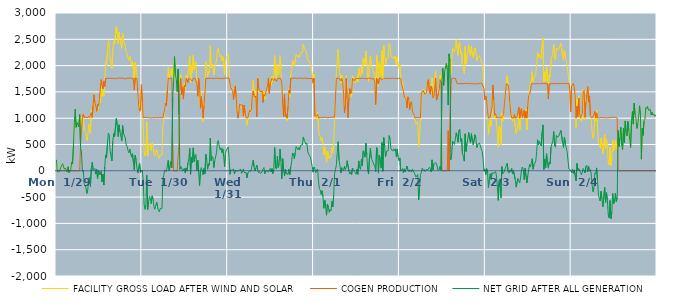
| Category | FACILITY GROSS LOAD AFTER WIND AND SOLAR | COGEN PRODUCTION | NET GRID AFTER ALL GENERATION |
|---|---|---|---|
|  Mon  1/29 | 209 | 0 | 209 |
|  Mon  1/29 | -16 | 0 | -16 |
|  Mon  1/29 | -6 | 0 | -6 |
|  Mon  1/29 | -16 | 0 | -16 |
|  Mon  1/29 | 22 | 0 | 22 |
|  Mon  1/29 | 5 | 0 | 5 |
|  Mon  1/29 | 108 | 0 | 108 |
|  Mon  1/29 | 135 | 0 | 135 |
|  Mon  1/29 | 73 | 0 | 73 |
|  Mon  1/29 | 30 | 0 | 30 |
|  Mon  1/29 | 54 | 0 | 54 |
|  Mon  1/29 | 37 | 0 | 37 |
|  Mon  1/29 | -21 | 0 | -21 |
|  Mon  1/29 | 78 | 0 | 78 |
|  Mon  1/29 | -37 | 0 | -37 |
|  Mon  1/29 | -8 | 0 | -8 |
|  Mon  1/29 | 23 | 0 | 23 |
|  Mon  1/29 | 167 | 0 | 167 |
|  Mon  1/29 | 128 | 0 | 128 |
|  Mon  1/29 | 474 | 0 | 474 |
|  Mon  1/29 | 912 | 0 | 912 |
|  Mon  1/29 | 1172 | 0 | 1172 |
|  Mon  1/29 | 826 | 0 | 826 |
|  Mon  1/29 | 916 | 0 | 916 |
|  Mon  1/29 | 912 | 0 | 912 |
|  Mon  1/29 | 835 | 0 | 835 |
|  Mon  1/29 | 1069 | 0 | 1069 |
|  Mon  1/29 | 931 | 511 | 420 |
|  Mon  1/29 | 860 | 502 | 358 |
|  Mon  1/29 | 994 | 1013 | -19 |
|  Mon  1/29 | 1088 | 1082 | 6 |
|  Mon  1/29 | 777 | 1016 | -239 |
|  Mon  1/29 | 767 | 1002 | -235 |
|  Mon  1/29 | 696 | 1015 | -319 |
|  Mon  1/29 | 570 | 1001 | -431 |
|  Mon  1/29 | 644 | 1007 | -363 |
|  Mon  1/29 | 887 | 1036 | -149 |
|  Mon  1/29 | 894 | 1013 | -119 |
|  Mon  1/29 | 714 | 1012 | -298 |
|  Mon  1/29 | 1152 | 1107 | 45 |
|  Mon  1/29 | 1173 | 1013 | 160 |
|  Mon  1/29 | 1250 | 1241 | 9 |
|  Mon  1/29 | 1454 | 1447 | 7 |
|  Mon  1/29 | 1335 | 1292 | 43 |
|  Mon  1/29 | 1159 | 1222 | -63 |
|  Mon  1/29 | 1159 | 1130 | 29 |
|  Mon  1/29 | 1120 | 1269 | -149 |
|  Mon  1/29 | 1238 | 1233 | 5 |
|  Mon  1/29 | 1373 | 1356 | 17 |
|  Mon  1/29 | 1294 | 1373 | -79 |
|  Mon  1/29 | 1721 | 1732 | -11 |
|  Mon  1/29 | 1412 | 1622 | -210 |
|  Mon  1/29 | 1496 | 1562 | -66 |
|  Mon  1/29 | 1431 | 1702 | -271 |
|  Mon  1/29 | 1677 | 1605 | 72 |
|  Mon  1/29 | 2059 | 1757 | 302 |
|  Mon  1/29 | 2002 | 1753 | 249 |
|  Mon  1/29 | 2262 | 1754 | 508 |
|  Mon  1/29 | 2477 | 1759 | 718 |
|  Mon  1/29 | 2448 | 1760 | 688 |
|  Mon  1/29 | 2137 | 1761 | 376 |
|  Mon  1/29 | 2142 | 1758 | 384 |
|  Mon  1/29 | 1943 | 1755 | 188 |
|  Mon  1/29 | 2318 | 1758 | 560 |
|  Mon  1/29 | 2466 | 1758 | 708 |
|  Mon  1/29 | 2408 | 1758 | 650 |
|  Mon  1/29 | 2426 | 1761 | 665 |
|  Mon  1/29 | 2746 | 1750 | 996 |
|  Mon  1/29 | 2613 | 1752 | 861 |
|  Mon  1/29 | 2416 | 1766 | 650 |
|  Mon  1/29 | 2637 | 1763 | 874 |
|  Mon  1/29 | 2499 | 1762 | 737 |
|  Mon  1/29 | 2412 | 1752 | 660 |
|  Mon  1/29 | 2327 | 1758 | 569 |
|  Mon  1/29 | 2616 | 1754 | 862 |
|  Mon  1/29 | 2475 | 1762 | 713 |
|  Mon  1/29 | 2453 | 1754 | 699 |
|  Mon  1/29 | 2366 | 1742 | 624 |
|  Mon  1/29 | 2255 | 1765 | 490 |
|  Mon  1/29 | 2222 | 1760 | 462 |
|  Mon  1/29 | 2142 | 1755 | 387 |
|  Mon  1/29 | 2101 | 1758 | 343 |
|  Mon  1/29 | 2179 | 1767 | 412 |
|  Mon  1/29 | 2080 | 1757 | 323 |
|  Mon  1/29 | 2013 | 1753 | 260 |
|  Mon  1/29 | 2085 | 1759 | 326 |
|  Mon  1/29 | 1922 | 1753 | 169 |
|  Mon  1/29 | 1557 | 1538 | 19 |
|  Mon  1/29 | 2060 | 1765 | 295 |
|  Mon  1/29 | 1977 | 1763 | 214 |
|  Mon  1/29 | 1813 | 1759 | 54 |
|  Mon  1/29 | 1451 | 1490 | -39 |
|  Mon  1/29 | 1204 | 1234 | -30 |
|  Mon  1/29 | 1273 | 1134 | 139 |
|  Mon  1/29 | 1128 | 1159 | -31 |
|  Mon  1/29 | 1616 | 1638 | -22 |
|  Tue  1/30 | 1338 | 1324 | 14 |
|  Tue  1/30 | 841 | 1013 | -172 |
|  Tue  1/30 | 369 | 1002 | -633 |
|  Tue  1/30 | 286 | 1017 | -731 |
|  Tue  1/30 | 344 | 1018 | -674 |
|  Tue  1/30 | 932 | 1016 | -84 |
|  Tue  1/30 | 278 | 1012 | -734 |
|  Tue  1/30 | 427 | 1011 | -584 |
|  Tue  1/30 | 517 | 1004 | -487 |
|  Tue  1/30 | 477 | 1000 | -523 |
|  Tue  1/30 | 382 | 1006 | -624 |
|  Tue  1/30 | 533 | 1009 | -476 |
|  Tue  1/30 | 483 | 1014 | -531 |
|  Tue  1/30 | 326 | 1005 | -679 |
|  Tue  1/30 | 285 | 1016 | -731 |
|  Tue  1/30 | 285 | 1011 | -726 |
|  Tue  1/30 | 410 | 1007 | -597 |
|  Tue  1/30 | 325 | 1005 | -680 |
|  Tue  1/30 | 257 | 1010 | -753 |
|  Tue  1/30 | 230 | 1012 | -782 |
|  Tue  1/30 | 300 | 1021 | -721 |
|  Tue  1/30 | 293 | 1007 | -714 |
|  Tue  1/30 | 300 | 1014 | -714 |
|  Tue  1/30 | 854 | 1012 | -158 |
|  Tue  1/30 | 934 | 1020 | -86 |
|  Tue  1/30 | 1172 | 1164 | 8 |
|  Tue  1/30 | 1292 | 1288 | 4 |
|  Tue  1/30 | 1231 | 1240 | -9 |
|  Tue  1/30 | 1525 | 1515 | 10 |
|  Tue  1/30 | 1964 | 1764 | 200 |
|  Tue  1/30 | 1759 | 1757 | 2 |
|  Tue  1/30 | 1842 | 1752 | 90 |
|  Tue  1/30 | 1939 | 1761 | 178 |
|  Tue  1/30 | 1811 | 1753 | 58 |
|  Tue  1/30 | 1953 | 544 | 1409 |
|  Tue  1/30 | 1686 | 0 | 1686 |
|  Tue  1/30 | 2172 | 0 | 2172 |
|  Tue  1/30 | 1828 | 0 | 1828 |
|  Tue  1/30 | 1736 | 0 | 1736 |
|  Tue  1/30 | 1506 | 0 | 1506 |
|  Tue  1/30 | 1933 | 0 | 1933 |
|  Tue  1/30 | 1575 | 510 | 1065 |
|  Tue  1/30 | 1683 | 1655 | 28 |
|  Tue  1/30 | 1836 | 1754 | 82 |
|  Tue  1/30 | 1506 | 1448 | 58 |
|  Tue  1/30 | 1588 | 1594 | -6 |
|  Tue  1/30 | 1364 | 1363 | 1 |
|  Tue  1/30 | 1671 | 1624 | 47 |
|  Tue  1/30 | 1554 | 1597 | -43 |
|  Tue  1/30 | 1814 | 1759 | 55 |
|  Tue  1/30 | 1761 | 1763 | -2 |
|  Tue  1/30 | 1826 | 1678 | 148 |
|  Tue  1/30 | 1981 | 1757 | 224 |
|  Tue  1/30 | 2187 | 1758 | 429 |
|  Tue  1/30 | 1672 | 1737 | -65 |
|  Tue  1/30 | 2004 | 1749 | 255 |
|  Tue  1/30 | 1862 | 1705 | 157 |
|  Tue  1/30 | 2194 | 1758 | 436 |
|  Tue  1/30 | 1925 | 1748 | 177 |
|  Tue  1/30 | 2041 | 1760 | 281 |
|  Tue  1/30 | 2068 | 1758 | 310 |
|  Tue  1/30 | 1657 | 1661 | -4 |
|  Tue  1/30 | 1621 | 1418 | 203 |
|  Tue  1/30 | 1734 | 1753 | -19 |
|  Tue  1/30 | 1332 | 1615 | -283 |
|  Tue  1/30 | 1192 | 1190 | 2 |
|  Tue  1/30 | 1471 | 1410 | 61 |
|  Tue  1/30 | 1217 | 1213 | 4 |
|  Tue  1/30 | 935 | 1012 | -77 |
|  Tue  1/30 | 1280 | 1238 | 42 |
|  Tue  1/30 | 1412 | 1469 | -57 |
|  Tue  1/30 | 2074 | 1760 | 314 |
|  Tue  1/30 | 1970 | 1755 | 215 |
|  Tue  1/30 | 1785 | 1755 | 30 |
|  Tue  1/30 | 1887 | 1753 | 134 |
|  Tue  1/30 | 1866 | 1762 | 104 |
|  Tue  1/30 | 2381 | 1760 | 621 |
|  Tue  1/30 | 1952 | 1760 | 192 |
|  Tue  1/30 | 2032 | 1760 | 272 |
|  Tue  1/30 | 2007 | 1756 | 251 |
|  Tue  1/30 | 1825 | 1764 | 61 |
|  Tue  1/30 | 1948 | 1757 | 191 |
|  Tue  1/30 | 1963 | 1754 | 209 |
|  Tue  1/30 | 2106 | 1764 | 342 |
|  Tue  1/30 | 2297 | 1755 | 542 |
|  Tue  1/30 | 2329 | 1755 | 574 |
|  Tue  1/30 | 2232 | 1758 | 474 |
|  Tue  1/30 | 2162 | 1762 | 400 |
|  Tue  1/30 | 2200 | 1763 | 437 |
|  Tue  1/30 | 2096 | 1749 | 347 |
|  Tue  1/30 | 2170 | 1753 | 417 |
|  Tue  1/30 | 2033 | 1761 | 272 |
|  Tue  1/30 | 1832 | 1755 | 77 |
|  Tue  1/30 | 2090 | 1760 | 330 |
|  Tue  1/30 | 2155 | 1763 | 392 |
|  Tue  1/30 | 2165 | 1762 | 403 |
|  Wed  1/31 | 2213 | 1761 | 452 |
|  Wed  1/31 | 2019 | 1765 | 254 |
|  Wed  1/31 | 1591 | 1658 | -67 |
|  Wed  1/31 | 1604 | 1583 | 21 |
|  Wed  1/31 | 1594 | 1595 | -1 |
|  Wed  1/31 | 1527 | 1527 | 0 |
|  Wed  1/31 | 1386 | 1350 | 36 |
|  Wed  1/31 | 1455 | 1513 | -58 |
|  Wed  1/31 | 1624 | 1617 | 7 |
|  Wed  1/31 | 1392 | 1392 | 0 |
|  Wed  1/31 | 1109 | 1113 | -4 |
|  Wed  1/31 | 1006 | 1001 | 5 |
|  Wed  1/31 | 1135 | 1130 | 5 |
|  Wed  1/31 | 1260 | 1273 | -13 |
|  Wed  1/31 | 1282 | 1250 | 32 |
|  Wed  1/31 | 1191 | 1239 | -48 |
|  Wed  1/31 | 1229 | 1248 | -19 |
|  Wed  1/31 | 1075 | 1039 | 36 |
|  Wed  1/31 | 1216 | 1250 | -34 |
|  Wed  1/31 | 1057 | 1084 | -27 |
|  Wed  1/31 | 977 | 1009 | -32 |
|  Wed  1/31 | 866 | 1003 | -137 |
|  Wed  1/31 | 965 | 1007 | -42 |
|  Wed  1/31 | 983 | 1011 | -28 |
|  Wed  1/31 | 1158 | 1151 | 7 |
|  Wed  1/31 | 1109 | 1124 | -15 |
|  Wed  1/31 | 1211 | 1175 | 36 |
|  Wed  1/31 | 1461 | 1433 | 28 |
|  Wed  1/31 | 1722 | 1517 | 205 |
|  Wed  1/31 | 1503 | 1429 | 74 |
|  Wed  1/31 | 1393 | 1398 | -5 |
|  Wed  1/31 | 1474 | 1423 | 51 |
|  Wed  1/31 | 1136 | 1028 | 108 |
|  Wed  1/31 | 1778 | 1762 | 16 |
|  Wed  1/31 | 1542 | 1577 | -35 |
|  Wed  1/31 | 1506 | 1519 | -13 |
|  Wed  1/31 | 1476 | 1527 | -51 |
|  Wed  1/31 | 1467 | 1500 | -33 |
|  Wed  1/31 | 1501 | 1523 | -22 |
|  Wed  1/31 | 1329 | 1297 | 32 |
|  Wed  1/31 | 1513 | 1451 | 62 |
|  Wed  1/31 | 1366 | 1423 | -57 |
|  Wed  1/31 | 1475 | 1479 | -4 |
|  Wed  1/31 | 1578 | 1565 | 13 |
|  Wed  1/31 | 1613 | 1609 | 4 |
|  Wed  1/31 | 1737 | 1763 | -26 |
|  Wed  1/31 | 1480 | 1473 | 7 |
|  Wed  1/31 | 1705 | 1661 | 44 |
|  Wed  1/31 | 1623 | 1646 | -23 |
|  Wed  1/31 | 1799 | 1757 | 42 |
|  Wed  1/31 | 1696 | 1749 | -53 |
|  Wed  1/31 | 1720 | 1713 | 7 |
|  Wed  1/31 | 2195 | 1754 | 441 |
|  Wed  1/31 | 1816 | 1761 | 55 |
|  Wed  1/31 | 1733 | 1699 | 34 |
|  Wed  1/31 | 2032 | 1755 | 277 |
|  Wed  1/31 | 1820 | 1756 | 64 |
|  Wed  1/31 | 1884 | 1753 | 131 |
|  Wed  1/31 | 2169 | 1756 | 413 |
|  Wed  1/31 | 1941 | 1753 | 188 |
|  Wed  1/31 | 1499 | 1650 | -151 |
|  Wed  1/31 | 1483 | 1252 | 231 |
|  Wed  1/31 | 1047 | 1033 | 14 |
|  Wed  1/31 | 1353 | 1453 | -100 |
|  Wed  1/31 | 1068 | 1034 | 34 |
|  Wed  1/31 | 1016 | 1072 | -56 |
|  Wed  1/31 | 951 | 1003 | -52 |
|  Wed  1/31 | 1158 | 1224 | -66 |
|  Wed  1/31 | 1566 | 1534 | 32 |
|  Wed  1/31 | 1401 | 1474 | -73 |
|  Wed  1/31 | 1840 | 1762 | 78 |
|  Wed  1/31 | 1928 | 1757 | 171 |
|  Wed  1/31 | 2097 | 1757 | 340 |
|  Wed  1/31 | 2081 | 1761 | 320 |
|  Wed  1/31 | 1995 | 1764 | 231 |
|  Wed  1/31 | 2114 | 1766 | 348 |
|  Wed  1/31 | 2221 | 1760 | 461 |
|  Wed  1/31 | 2217 | 1749 | 468 |
|  Wed  1/31 | 2154 | 1754 | 400 |
|  Wed  1/31 | 2199 | 1754 | 445 |
|  Wed  1/31 | 2164 | 1767 | 397 |
|  Wed  1/31 | 2246 | 1758 | 488 |
|  Wed  1/31 | 2249 | 1758 | 491 |
|  Wed  1/31 | 2254 | 1761 | 493 |
|  Wed  1/31 | 2400 | 1757 | 643 |
|  Wed  1/31 | 2338 | 1761 | 577 |
|  Wed  1/31 | 2312 | 1763 | 549 |
|  Wed  1/31 | 2265 | 1762 | 503 |
|  Wed  1/31 | 2282 | 1757 | 525 |
|  Wed  1/31 | 2115 | 1757 | 358 |
|  Wed  1/31 | 2071 | 1754 | 317 |
|  Wed  1/31 | 2091 | 1755 | 336 |
|  Wed  1/31 | 2011 | 1755 | 256 |
|  Wed  1/31 | 1999 | 1757 | 242 |
|  Wed  1/31 | 1837 | 1755 | 82 |
|  Wed  1/31 | 1647 | 1673 | -26 |
|  Thu  2/1 | 1832 | 1760 | 72 |
|  Thu  2/1 | 1070 | 1041 | 29 |
|  Thu  2/1 | 991 | 1024 | -33 |
|  Thu  2/1 | 1051 | 1038 | 13 |
|  Thu  2/1 | 1109 | 1076 | 33 |
|  Thu  2/1 | 808 | 1003 | -195 |
|  Thu  2/1 | 682 | 1016 | -334 |
|  Thu  2/1 | 643 | 1012 | -369 |
|  Thu  2/1 | 570 | 1019 | -449 |
|  Thu  2/1 | 631 | 1010 | -379 |
|  Thu  2/1 | 515 | 1005 | -490 |
|  Thu  2/1 | 304 | 1016 | -712 |
|  Thu  2/1 | 449 | 1011 | -562 |
|  Thu  2/1 | 325 | 1017 | -692 |
|  Thu  2/1 | 164 | 1008 | -844 |
|  Thu  2/1 | 375 | 1006 | -631 |
|  Thu  2/1 | 315 | 1006 | -691 |
|  Thu  2/1 | 226 | 1015 | -789 |
|  Thu  2/1 | 285 | 1023 | -738 |
|  Thu  2/1 | 256 | 1016 | -760 |
|  Thu  2/1 | 441 | 1020 | -579 |
|  Thu  2/1 | 338 | 1022 | -684 |
|  Thu  2/1 | 537 | 1004 | -467 |
|  Thu  2/1 | 969 | 1017 | -48 |
|  Thu  2/1 | 1413 | 1388 | 25 |
|  Thu  2/1 | 1875 | 1761 | 114 |
|  Thu  2/1 | 2112 | 1760 | 352 |
|  Thu  2/1 | 2308 | 1755 | 553 |
|  Thu  2/1 | 1954 | 1756 | 198 |
|  Thu  2/1 | 1846 | 1747 | 99 |
|  Thu  2/1 | 1667 | 1710 | -43 |
|  Thu  2/1 | 1819 | 1759 | 60 |
|  Thu  2/1 | 1717 | 1683 | 34 |
|  Thu  2/1 | 1471 | 1471 | 0 |
|  Thu  2/1 | 1187 | 1098 | 89 |
|  Thu  2/1 | 1269 | 1243 | 26 |
|  Thu  2/1 | 1816 | 1756 | 60 |
|  Thu  2/1 | 1571 | 1379 | 192 |
|  Thu  2/1 | 1191 | 1012 | 179 |
|  Thu  2/1 | 1380 | 1382 | -2 |
|  Thu  2/1 | 1503 | 1564 | -61 |
|  Thu  2/1 | 1445 | 1463 | -18 |
|  Thu  2/1 | 1407 | 1483 | -76 |
|  Thu  2/1 | 1811 | 1758 | 53 |
|  Thu  2/1 | 1783 | 1759 | 24 |
|  Thu  2/1 | 1701 | 1710 | -9 |
|  Thu  2/1 | 1673 | 1702 | -29 |
|  Thu  2/1 | 1697 | 1763 | -66 |
|  Thu  2/1 | 1792 | 1762 | 30 |
|  Thu  2/1 | 1683 | 1751 | -68 |
|  Thu  2/1 | 1949 | 1761 | 188 |
|  Thu  2/1 | 1821 | 1759 | 62 |
|  Thu  2/1 | 1788 | 1759 | 29 |
|  Thu  2/1 | 1982 | 1759 | 223 |
|  Thu  2/1 | 1853 | 1759 | 94 |
|  Thu  2/1 | 2141 | 1759 | 382 |
|  Thu  2/1 | 2099 | 1750 | 349 |
|  Thu  2/1 | 2014 | 1755 | 259 |
|  Thu  2/1 | 2277 | 1750 | 527 |
|  Thu  2/1 | 2049 | 1748 | 301 |
|  Thu  2/1 | 1774 | 1756 | 18 |
|  Thu  2/1 | 1697 | 1759 | -62 |
|  Thu  2/1 | 2016 | 1762 | 254 |
|  Thu  2/1 | 2190 | 1759 | 431 |
|  Thu  2/1 | 1997 | 1759 | 238 |
|  Thu  2/1 | 1954 | 1746 | 208 |
|  Thu  2/1 | 1973 | 1761 | 212 |
|  Thu  2/1 | 1866 | 1755 | 111 |
|  Thu  2/1 | 1786 | 1695 | 91 |
|  Thu  2/1 | 1242 | 1255 | -13 |
|  Thu  2/1 | 2199 | 1756 | 443 |
|  Thu  2/1 | 2161 | 1763 | 398 |
|  Thu  2/1 | 1605 | 1649 | -44 |
|  Thu  2/1 | 2060 | 1762 | 298 |
|  Thu  2/1 | 1978 | 1753 | 225 |
|  Thu  2/1 | 1795 | 1745 | 50 |
|  Thu  2/1 | 2287 | 1749 | 538 |
|  Thu  2/1 | 1728 | 1736 | -8 |
|  Thu  2/1 | 2389 | 1757 | 632 |
|  Thu  2/1 | 2191 | 1749 | 442 |
|  Thu  2/1 | 2020 | 1755 | 265 |
|  Thu  2/1 | 2135 | 1763 | 372 |
|  Thu  2/1 | 2120 | 1762 | 358 |
|  Thu  2/1 | 2140 | 1758 | 382 |
|  Thu  2/1 | 2422 | 1753 | 669 |
|  Thu  2/1 | 2366 | 1763 | 603 |
|  Thu  2/1 | 2178 | 1760 | 418 |
|  Thu  2/1 | 2180 | 1757 | 423 |
|  Thu  2/1 | 2137 | 1763 | 374 |
|  Thu  2/1 | 2173 | 1756 | 417 |
|  Thu  2/1 | 2133 | 1754 | 379 |
|  Thu  2/1 | 2177 | 1760 | 417 |
|  Thu  2/1 | 2025 | 1755 | 270 |
|  Thu  2/1 | 2166 | 1756 | 410 |
|  Thu  2/1 | 2015 | 1750 | 265 |
|  Thu  2/1 | 1948 | 1757 | 191 |
|  Fri  2/2 | 2013 | 1767 | 246 |
|  Fri  2/2 | 1739 | 1744 | -5 |
|  Fri  2/2 | 1643 | 1646 | -3 |
|  Fri  2/2 | 1697 | 1656 | 41 |
|  Fri  2/2 | 1469 | 1511 | -42 |
|  Fri  2/2 | 1439 | 1402 | 37 |
|  Fri  2/2 | 1361 | 1381 | -20 |
|  Fri  2/2 | 1333 | 1351 | -18 |
|  Fri  2/2 | 1286 | 1195 | 91 |
|  Fri  2/2 | 1423 | 1408 | 15 |
|  Fri  2/2 | 1357 | 1371 | -14 |
|  Fri  2/2 | 1186 | 1167 | 19 |
|  Fri  2/2 | 1291 | 1287 | 4 |
|  Fri  2/2 | 1289 | 1314 | -25 |
|  Fri  2/2 | 1170 | 1136 | 34 |
|  Fri  2/2 | 1112 | 1093 | 19 |
|  Fri  2/2 | 1020 | 1054 | -34 |
|  Fri  2/2 | 958 | 1002 | -44 |
|  Fri  2/2 | 885 | 1003 | -118 |
|  Fri  2/2 | 889 | 1013 | -124 |
|  Fri  2/2 | 945 | 1015 | -70 |
|  Fri  2/2 | 454 | 1008 | -554 |
|  Fri  2/2 | 691 | 1017 | -326 |
|  Fri  2/2 | 941 | 1013 | -72 |
|  Fri  2/2 | 1444 | 1481 | -37 |
|  Fri  2/2 | 1536 | 1486 | 50 |
|  Fri  2/2 | 1529 | 1524 | 5 |
|  Fri  2/2 | 1549 | 1523 | 26 |
|  Fri  2/2 | 1439 | 1453 | -14 |
|  Fri  2/2 | 1429 | 1444 | -15 |
|  Fri  2/2 | 1525 | 1495 | 30 |
|  Fri  2/2 | 1709 | 1700 | 9 |
|  Fri  2/2 | 1737 | 1735 | 2 |
|  Fri  2/2 | 1565 | 1497 | 68 |
|  Fri  2/2 | 1499 | 1457 | 42 |
|  Fri  2/2 | 1587 | 1609 | -22 |
|  Fri  2/2 | 1773 | 1565 | 208 |
|  Fri  2/2 | 1395 | 1384 | 11 |
|  Fri  2/2 | 1552 | 1421 | 131 |
|  Fri  2/2 | 1726 | 1571 | 155 |
|  Fri  2/2 | 1901 | 1765 | 136 |
|  Fri  2/2 | 1484 | 1345 | 139 |
|  Fri  2/2 | 1407 | 1351 | 56 |
|  Fri  2/2 | 1467 | 1466 | 1 |
|  Fri  2/2 | 1573 | 1541 | 32 |
|  Fri  2/2 | 1820 | 1733 | 87 |
|  Fri  2/2 | 1685 | 1675 | 10 |
|  Fri  2/2 | 1693 | 0 | 1693 |
|  Fri  2/2 | 1955 | 0 | 1955 |
|  Fri  2/2 | 1625 | 0 | 1625 |
|  Fri  2/2 | 1884 | 0 | 1884 |
|  Fri  2/2 | 1901 | 0 | 1901 |
|  Fri  2/2 | 2040 | 0 | 2040 |
|  Fri  2/2 | 1933 | 0 | 1933 |
|  Fri  2/2 | 2016 | 764 | 1252 |
|  Fri  2/2 | 2224 | 0 | 2224 |
|  Fri  2/2 | 2089 | 0 | 2089 |
|  Fri  2/2 | 1820 | 1609 | 211 |
|  Fri  2/2 | 2073 | 1757 | 316 |
|  Fri  2/2 | 2326 | 1761 | 565 |
|  Fri  2/2 | 2321 | 1756 | 565 |
|  Fri  2/2 | 2259 | 1757 | 502 |
|  Fri  2/2 | 2363 | 1760 | 603 |
|  Fri  2/2 | 2491 | 1768 | 723 |
|  Fri  2/2 | 2316 | 1656 | 660 |
|  Fri  2/2 | 2194 | 1652 | 542 |
|  Fri  2/2 | 2422 | 1655 | 767 |
|  Fri  2/2 | 2454 | 1664 | 790 |
|  Fri  2/2 | 2221 | 1661 | 560 |
|  Fri  2/2 | 2271 | 1659 | 612 |
|  Fri  2/2 | 1984 | 1655 | 329 |
|  Fri  2/2 | 1935 | 1661 | 274 |
|  Fri  2/2 | 1845 | 1661 | 184 |
|  Fri  2/2 | 2364 | 1660 | 704 |
|  Fri  2/2 | 2029 | 1663 | 366 |
|  Fri  2/2 | 2174 | 1657 | 517 |
|  Fri  2/2 | 2269 | 1656 | 613 |
|  Fri  2/2 | 2382 | 1653 | 729 |
|  Fri  2/2 | 2250 | 1662 | 588 |
|  Fri  2/2 | 2192 | 1660 | 532 |
|  Fri  2/2 | 2362 | 1656 | 706 |
|  Fri  2/2 | 2221 | 1655 | 566 |
|  Fri  2/2 | 2145 | 1653 | 492 |
|  Fri  2/2 | 2129 | 1653 | 476 |
|  Fri  2/2 | 2338 | 1653 | 685 |
|  Fri  2/2 | 2270 | 1650 | 620 |
|  Fri  2/2 | 2090 | 1651 | 439 |
|  Fri  2/2 | 2161 | 1662 | 499 |
|  Fri  2/2 | 2144 | 1655 | 489 |
|  Fri  2/2 | 2189 | 1661 | 528 |
|  Fri  2/2 | 2207 | 1663 | 544 |
|  Fri  2/2 | 2071 | 1653 | 418 |
|  Fri  2/2 | 2025 | 1652 | 373 |
|  Fri  2/2 | 1892 | 1658 | 234 |
|  Fri  2/2 | 1562 | 1567 | -5 |
|  Fri  2/2 | 1383 | 1347 | 36 |
|  Sat  2/3 | 1347 | 1420 | -73 |
|  Sat  2/3 | 1373 | 1333 | 40 |
|  Sat  2/3 | 1128 | 1132 | -4 |
|  Sat  2/3 | 683 | 1002 | -319 |
|  Sat  2/3 | 842 | 1013 | -171 |
|  Sat  2/3 | 960 | 1016 | -56 |
|  Sat  2/3 | 847 | 1011 | -164 |
|  Sat  2/3 | 1175 | 1218 | -43 |
|  Sat  2/3 | 1608 | 1632 | -24 |
|  Sat  2/3 | 1302 | 1347 | -45 |
|  Sat  2/3 | 1002 | 1056 | -54 |
|  Sat  2/3 | 1069 | 1086 | -17 |
|  Sat  2/3 | 916 | 1014 | -98 |
|  Sat  2/3 | 720 | 1018 | -298 |
|  Sat  2/3 | 447 | 1009 | -562 |
|  Sat  2/3 | 824 | 1006 | -182 |
|  Sat  2/3 | 851 | 1005 | -154 |
|  Sat  2/3 | 489 | 1004 | -515 |
|  Sat  2/3 | 1098 | 1020 | 78 |
|  Sat  2/3 | 943 | 1002 | -59 |
|  Sat  2/3 | 1037 | 1072 | -35 |
|  Sat  2/3 | 1299 | 1304 | -5 |
|  Sat  2/3 | 1532 | 1481 | 51 |
|  Sat  2/3 | 1701 | 1656 | 45 |
|  Sat  2/3 | 1805 | 1660 | 145 |
|  Sat  2/3 | 1626 | 1635 | -9 |
|  Sat  2/3 | 1485 | 1528 | -43 |
|  Sat  2/3 | 1294 | 1277 | 17 |
|  Sat  2/3 | 1065 | 1083 | -18 |
|  Sat  2/3 | 1053 | 1008 | 45 |
|  Sat  2/3 | 942 | 996 | -54 |
|  Sat  2/3 | 1002 | 1002 | 0 |
|  Sat  2/3 | 1077 | 1071 | 6 |
|  Sat  2/3 | 838 | 1003 | -165 |
|  Sat  2/3 | 704 | 1015 | -311 |
|  Sat  2/3 | 701 | 1013 | -312 |
|  Sat  2/3 | 857 | 1005 | -148 |
|  Sat  2/3 | 1075 | 1207 | -132 |
|  Sat  2/3 | 770 | 1002 | -232 |
|  Sat  2/3 | 882 | 1017 | -135 |
|  Sat  2/3 | 1199 | 1186 | 13 |
|  Sat  2/3 | 1086 | 1014 | 72 |
|  Sat  2/3 | 1061 | 1044 | 17 |
|  Sat  2/3 | 985 | 1154 | -169 |
|  Sat  2/3 | 1049 | 1002 | 47 |
|  Sat  2/3 | 1172 | 1127 | 45 |
|  Sat  2/3 | 783 | 1013 | -230 |
|  Sat  2/3 | 1132 | 1224 | -92 |
|  Sat  2/3 | 1327 | 1436 | -109 |
|  Sat  2/3 | 1576 | 1456 | 120 |
|  Sat  2/3 | 1590 | 1519 | 71 |
|  Sat  2/3 | 1724 | 1650 | 74 |
|  Sat  2/3 | 1886 | 1657 | 229 |
|  Sat  2/3 | 1687 | 1657 | 30 |
|  Sat  2/3 | 1773 | 1650 | 123 |
|  Sat  2/3 | 1797 | 1650 | 147 |
|  Sat  2/3 | 1845 | 1656 | 189 |
|  Sat  2/3 | 2026 | 1658 | 368 |
|  Sat  2/3 | 2254 | 1664 | 590 |
|  Sat  2/3 | 2148 | 1656 | 492 |
|  Sat  2/3 | 2210 | 1652 | 558 |
|  Sat  2/3 | 2166 | 1652 | 514 |
|  Sat  2/3 | 2125 | 1650 | 475 |
|  Sat  2/3 | 2384 | 1659 | 725 |
|  Sat  2/3 | 2526 | 1653 | 873 |
|  Sat  2/3 | 1690 | 1664 | 26 |
|  Sat  2/3 | 1877 | 1661 | 216 |
|  Sat  2/3 | 1710 | 1656 | 54 |
|  Sat  2/3 | 1986 | 1662 | 324 |
|  Sat  2/3 | 1803 | 1656 | 147 |
|  Sat  2/3 | 1418 | 1367 | 51 |
|  Sat  2/3 | 1822 | 1653 | 169 |
|  Sat  2/3 | 1786 | 1655 | 131 |
|  Sat  2/3 | 2105 | 1653 | 452 |
|  Sat  2/3 | 2105 | 1655 | 450 |
|  Sat  2/3 | 2225 | 1661 | 564 |
|  Sat  2/3 | 2403 | 1656 | 747 |
|  Sat  2/3 | 2135 | 1656 | 479 |
|  Sat  2/3 | 2115 | 1665 | 450 |
|  Sat  2/3 | 2334 | 1661 | 673 |
|  Sat  2/3 | 2296 | 1654 | 642 |
|  Sat  2/3 | 2281 | 1657 | 624 |
|  Sat  2/3 | 2319 | 1655 | 664 |
|  Sat  2/3 | 2378 | 1655 | 723 |
|  Sat  2/3 | 2425 | 1658 | 767 |
|  Sat  2/3 | 2431 | 1659 | 772 |
|  Sat  2/3 | 2194 | 1659 | 535 |
|  Sat  2/3 | 2104 | 1662 | 442 |
|  Sat  2/3 | 2296 | 1656 | 640 |
|  Sat  2/3 | 2183 | 1655 | 528 |
|  Sat  2/3 | 2099 | 1657 | 442 |
|  Sat  2/3 | 2022 | 1661 | 361 |
|  Sat  2/3 | 2014 | 1656 | 358 |
|  Sat  2/3 | 1699 | 1664 | 35 |
|  Sat  2/3 | 1563 | 1545 | 18 |
|  Sat  2/3 | 1136 | 1123 | 13 |
|  Sun  2/4 | 1569 | 1604 | -35 |
|  Sun  2/4 | 1630 | 1604 | 26 |
|  Sun  2/4 | 1612 | 1660 | -48 |
|  Sun  2/4 | 1590 | 1573 | 17 |
|  Sun  2/4 | 1444 | 1434 | 10 |
|  Sun  2/4 | 815 | 1004 | -189 |
|  Sun  2/4 | 1368 | 1228 | 140 |
|  Sun  2/4 | 1037 | 1030 | 7 |
|  Sun  2/4 | 1427 | 1383 | 44 |
|  Sun  2/4 | 1148 | 1106 | 42 |
|  Sun  2/4 | 978 | 1011 | -33 |
|  Sun  2/4 | 930 | 1005 | -75 |
|  Sun  2/4 | 1062 | 1088 | -26 |
|  Sun  2/4 | 1548 | 1503 | 45 |
|  Sun  2/4 | 1535 | 1528 | 7 |
|  Sun  2/4 | 977 | 1018 | -41 |
|  Sun  2/4 | 1383 | 1299 | 84 |
|  Sun  2/4 | 1561 | 1457 | 104 |
|  Sun  2/4 | 1582 | 1600 | -18 |
|  Sun  2/4 | 1391 | 1304 | 87 |
|  Sun  2/4 | 1419 | 1424 | -5 |
|  Sun  2/4 | 1076 | 1056 | 20 |
|  Sun  2/4 | 952 | 1014 | -62 |
|  Sun  2/4 | 741 | 1018 | -277 |
|  Sun  2/4 | 620 | 1017 | -397 |
|  Sun  2/4 | 693 | 1013 | -320 |
|  Sun  2/4 | 1087 | 1127 | -40 |
|  Sun  2/4 | 949 | 1009 | -60 |
|  Sun  2/4 | 1156 | 1101 | 55 |
|  Sun  2/4 | 816 | 1009 | -193 |
|  Sun  2/4 | 542 | 1007 | -465 |
|  Sun  2/4 | 483 | 1004 | -521 |
|  Sun  2/4 | 431 | 1005 | -574 |
|  Sun  2/4 | 623 | 1014 | -391 |
|  Sun  2/4 | 479 | 1012 | -533 |
|  Sun  2/4 | 322 | 1005 | -683 |
|  Sun  2/4 | 326 | 1019 | -693 |
|  Sun  2/4 | 691 | 1009 | -318 |
|  Sun  2/4 | 414 | 1016 | -602 |
|  Sun  2/4 | 592 | 1006 | -414 |
|  Sun  2/4 | 462 | 1016 | -554 |
|  Sun  2/4 | 166 | 1006 | -840 |
|  Sun  2/4 | 114 | 1008 | -894 |
|  Sun  2/4 | 448 | 1013 | -565 |
|  Sun  2/4 | 101 | 1014 | -913 |
|  Sun  2/4 | 231 | 1017 | -786 |
|  Sun  2/4 | 582 | 1013 | -431 |
|  Sun  2/4 | 388 | 1014 | -626 |
|  Sun  2/4 | 427 | 1006 | -579 |
|  Sun  2/4 | 590 | 1016 | -426 |
|  Sun  2/4 | 418 | 1006 | -588 |
|  Sun  2/4 | 498 | 1004 | -506 |
|  Sun  2/4 | 768 | 0 | 768 |
|  Sun  2/4 | 460 | 0 | 460 |
|  Sun  2/4 | 630 | 0 | 630 |
|  Sun  2/4 | 826 | 0 | 826 |
|  Sun  2/4 | 495 | 0 | 495 |
|  Sun  2/4 | 399 | 0 | 399 |
|  Sun  2/4 | 809 | 0 | 809 |
|  Sun  2/4 | 531 | 0 | 531 |
|  Sun  2/4 | 948 | 0 | 948 |
|  Sun  2/4 | 724 | 0 | 724 |
|  Sun  2/4 | 662 | 0 | 662 |
|  Sun  2/4 | 939 | 0 | 939 |
|  Sun  2/4 | 764 | 0 | 764 |
|  Sun  2/4 | 781 | 0 | 781 |
|  Sun  2/4 | 444 | 0 | 444 |
|  Sun  2/4 | 949 | 0 | 949 |
|  Sun  2/4 | 1128 | 0 | 1128 |
|  Sun  2/4 | 887 | 0 | 887 |
|  Sun  2/4 | 1286 | 0 | 1286 |
|  Sun  2/4 | 1073 | 0 | 1073 |
|  Sun  2/4 | 1001 | 0 | 1001 |
|  Sun  2/4 | 805 | 0 | 805 |
|  Sun  2/4 | 883 | 0 | 883 |
|  Sun  2/4 | 1039 | 0 | 1039 |
|  Sun  2/4 | 1236 | 0 | 1236 |
|  Sun  2/4 | 1055 | 0 | 1055 |
|  Sun  2/4 | 220 | 0 | 220 |
|  Sun  2/4 | 813 | 0 | 813 |
|  Sun  2/4 | 673 | 0 | 673 |
|  Sun  2/4 | 951 | 0 | 951 |
|  Sun  2/4 | 973 | 0 | 973 |
|  Sun  2/4 | 1203 | 0 | 1203 |
|  Sun  2/4 | 1176 | 0 | 1176 |
|  Sun  2/4 | 1226 | 0 | 1226 |
|  Sun  2/4 | 1151 | 0 | 1151 |
|  Sun  2/4 | 1141 | 0 | 1141 |
|  Sun  2/4 | 1167 | 0 | 1167 |
|  Sun  2/4 | 1060 | 0 | 1060 |
|  Sun  2/4 | 1114 | 0 | 1114 |
|  Sun  2/4 | 1059 | 0 | 1059 |
|  Sun  2/4 | 1081 | 0 | 1081 |
|  Sun  2/4 | 1033 | 0 | 1033 |
|  Sun  2/4 | 1065 | 0 | 1065 |
|  Sun  2/4 | 1070 | 0 | 1070 |